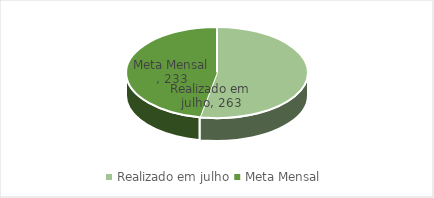
| Category | Series 0 |
|---|---|
| Realizado em julho | 263 |
| Meta Mensal  | 233 |